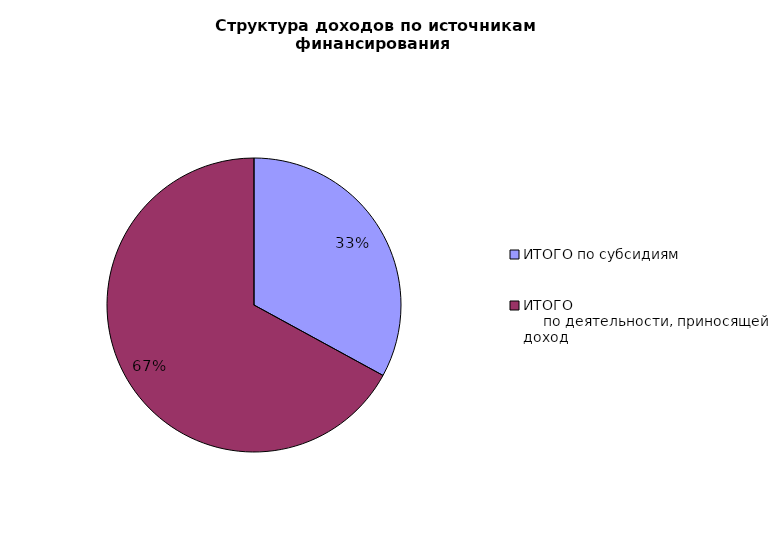
| Category | Series 0 |
|---|---|
| ИТОГО по субсидиям | 519648.46 |
| ИТОГО                                                    по деятельности, приносящей доход  | 1057243.1 |